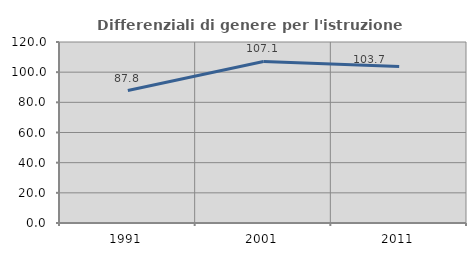
| Category | Differenziali di genere per l'istruzione superiore |
|---|---|
| 1991.0 | 87.824 |
| 2001.0 | 107.12 |
| 2011.0 | 103.676 |